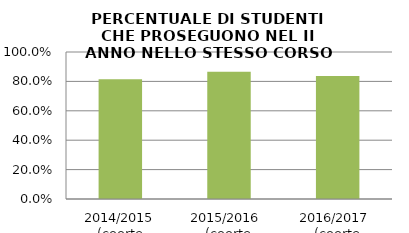
| Category | 2014/2015 (coorte 2013/14) 2015/2016  (coorte 2014/15) 2016/2017  (coorte 2015/16) |
|---|---|
| 2014/2015 (coorte 2013/14) | 0.815 |
| 2015/2016  (coorte 2014/15) | 0.866 |
| 2016/2017  (coorte 2015/16) | 0.837 |